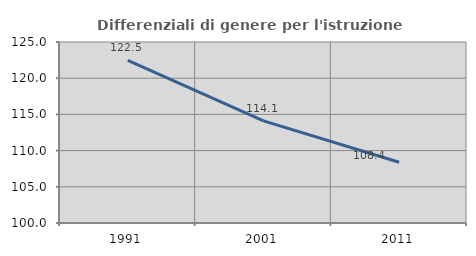
| Category | Differenziali di genere per l'istruzione superiore |
|---|---|
| 1991.0 | 122.468 |
| 2001.0 | 114.111 |
| 2011.0 | 108.389 |